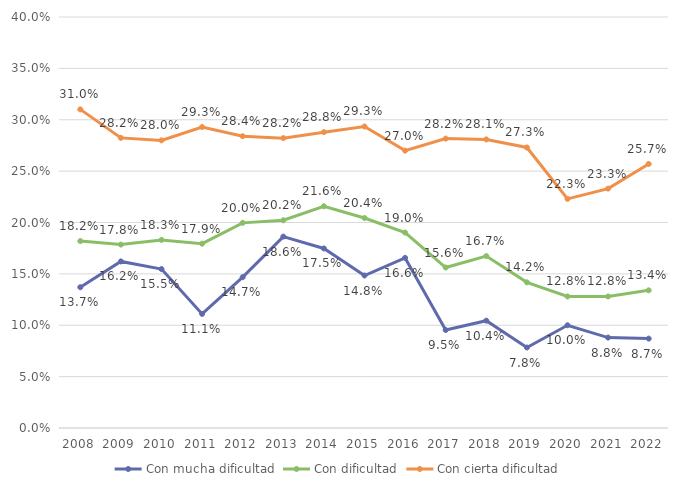
| Category | Con mucha dificultad | Con dificultad | Con cierta dificultad |
|---|---|---|---|
| 2008.0 | 0.137 | 0.182 | 0.31 |
| 2009.0 | 0.162 | 0.178 | 0.282 |
| 2010.0 | 0.155 | 0.183 | 0.28 |
| 2011.0 | 0.111 | 0.179 | 0.293 |
| 2012.0 | 0.147 | 0.2 | 0.284 |
| 2013.0 | 0.186 | 0.202 | 0.282 |
| 2014.0 | 0.175 | 0.216 | 0.288 |
| 2015.0 | 0.148 | 0.204 | 0.293 |
| 2016.0 | 0.166 | 0.19 | 0.27 |
| 2017.0 | 0.095 | 0.156 | 0.282 |
| 2018.0 | 0.104 | 0.167 | 0.281 |
| 2019.0 | 0.078 | 0.142 | 0.273 |
| 2020.0 | 0.1 | 0.128 | 0.223 |
| 2021.0 | 0.088 | 0.128 | 0.233 |
| 2022.0 | 0.087 | 0.134 | 0.257 |